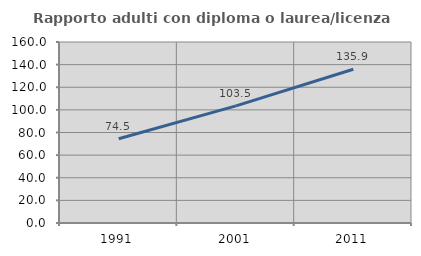
| Category | Rapporto adulti con diploma o laurea/licenza media  |
|---|---|
| 1991.0 | 74.468 |
| 2001.0 | 103.546 |
| 2011.0 | 135.897 |